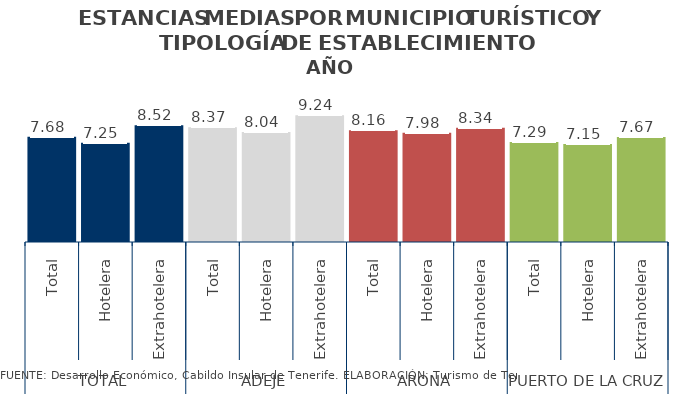
| Category | Series 2 |
|---|---|
| 0 | 7.685 |
| 1 | 7.252 |
| 2 | 8.525 |
| 3 | 8.367 |
| 4 | 8.035 |
| 5 | 9.243 |
| 6 | 8.156 |
| 7 | 7.977 |
| 8 | 8.339 |
| 9 | 7.291 |
| 10 | 7.151 |
| 11 | 7.671 |